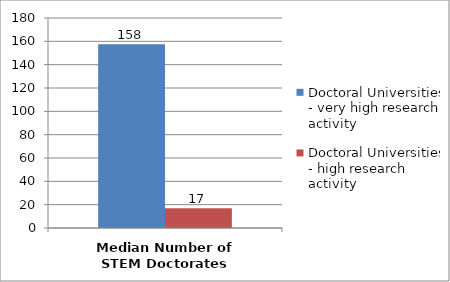
| Category | Doctoral Universities - very high research activity | Doctoral Universities - high research activity |
|---|---|---|
| Median Number of STEM Doctorates | 157.5 | 17 |